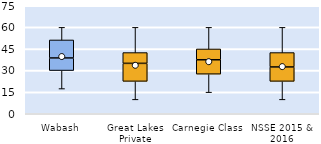
| Category | 25th | 50th | 75th |
|---|---|---|---|
| Wabash | 30 | 8.75 | 12.5 |
| Great Lakes Private | 22.5 | 12.5 | 7.5 |
| Carnegie Class | 27.5 | 10 | 7.5 |
| NSSE 2015 & 2016 | 22.5 | 10 | 10 |